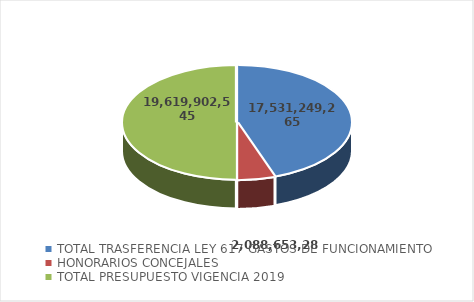
| Category | EJECUCION PRESUPUESTAL CONCEJO MUNICIPAL DE CALI   PRESUPUESTO INICIAL  | Series 1 |
|---|---|---|
| TOTAL TRASFERENCIA LEY 617 GASTOS DE FUNCIONAMIENTO  | 17531249265 | 17531249265 |
| HONORARIOS CONCEJALES  | 2088653280 | 2088653280 |
| TOTAL PRESUPUESTO VIGENCIA 2019  | 19619902545 | 19619902545 |